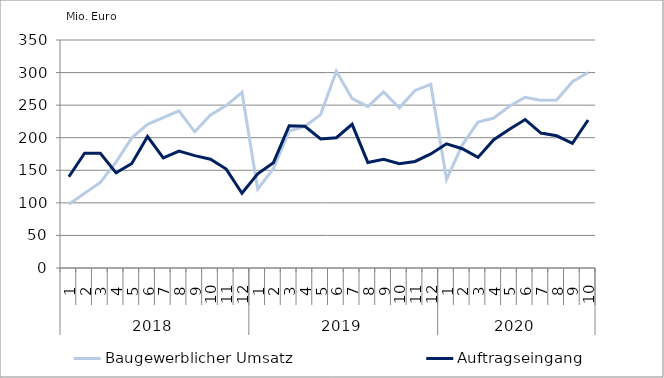
| Category | Baugewerblicher Umsatz | Auftragseingang |
|---|---|---|
| 0 | 97959.056 | 140119.385 |
| 1 | 114756.787 | 176330.213 |
| 2 | 131454.642 | 176241.061 |
| 3 | 162648.053 | 146063.407 |
| 4 | 199809.407 | 160551.931 |
| 5 | 220535.974 | 201835.846 |
| 6 | 230672.472 | 169132.23 |
| 7 | 241233.619 | 179396.293 |
| 8 | 209099.292 | 172542.764 |
| 9 | 234953.007 | 166991.729 |
| 10 | 249410.043 | 151835.629 |
| 11 | 269773.227 | 114807.456 |
| 12 | 120975.133 | 144510.881 |
| 13 | 152329.786 | 161685.201 |
| 14 | 210227.67 | 218455.879 |
| 15 | 217522.321 | 217610.064 |
| 16 | 235490.429 | 198110.439 |
| 17 | 301963.302 | 200012.086 |
| 18 | 259975.317 | 220559.061 |
| 19 | 247779.658 | 162059.723 |
| 20 | 270249.609 | 166829.611 |
| 21 | 245966.91 | 160120.773 |
| 22 | 272620.351 | 163589.389 |
| 23 | 281810.121 | 175051.247 |
| 24 | 136135.432 | 190647.086 |
| 25 | 188682.361 | 183141.14 |
| 26 | 224009.315 | 169770.009 |
| 27 | 230172.252 | 196979.845 |
| 28 | 248410.714 | 212955.83 |
| 29 | 262078.128 | 227853.487 |
| 30 | 257360.37 | 207209.188 |
| 31 | 257932.168 | 202976.091 |
| 32 | 285866.269 | 191463.844 |
| 33 | 300164.57 | 227245.467 |